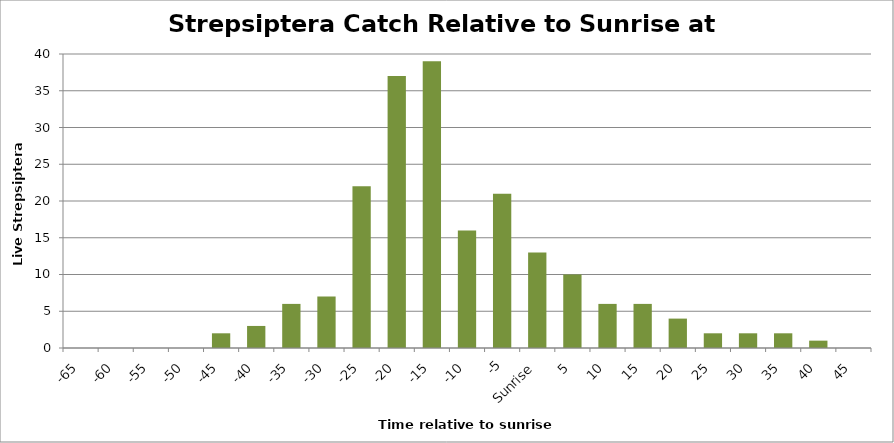
| Category | Series 0 |
|---|---|
| -65 | 0 |
| -60 | 0 |
| -55 | 0 |
| -50 | 0 |
| -45 | 2 |
| -40 | 3 |
| -35 | 6 |
| -30 | 7 |
| -25 | 22 |
| -20 | 37 |
| -15 | 39 |
| -10 | 16 |
| -5 | 21 |
| Sunrise | 13 |
| 5 | 10 |
| 10 | 6 |
| 15 | 6 |
| 20 | 4 |
| 25 | 2 |
| 30 | 2 |
| 35 | 2 |
| 40 | 1 |
| 45 | 0 |